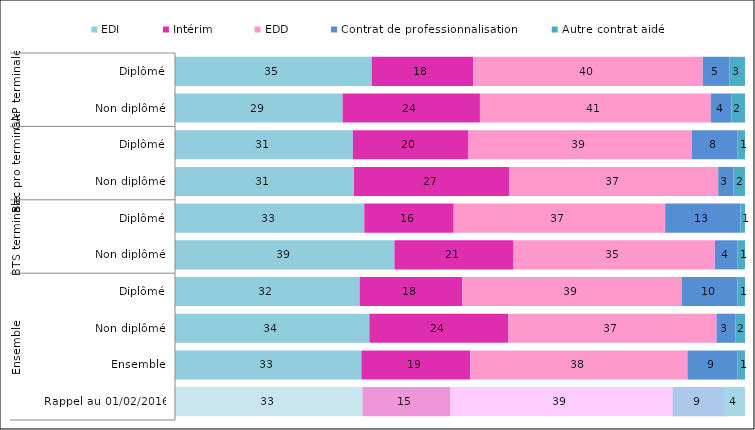
| Category | EDI | Intérim | EDD | Contrat de professionnalisation | Autre contrat aidé |
|---|---|---|---|---|---|
| 0 | 34.5 | 17.8 | 40.3 | 4.7 | 2.7 |
| 1 | 29.4 | 24.1 | 40.5 | 3.6 | 2.4 |
| 2 | 31.2 | 20.2 | 39.3 | 8 | 1.3 |
| 3 | 31.4 | 27.3 | 36.6 | 2.7 | 2 |
| 4 | 33.2 | 15.7 | 37.1 | 13.2 | 0.8 |
| 5 | 38.5 | 20.9 | 35.3 | 4 | 1.3 |
| 6 | 32.4 | 18 | 38.5 | 9.8 | 1.3 |
| 7 | 34.1 | 24.4 | 36.5 | 3.3 | 1.7 |
| 8 | 32.7 | 19.1 | 38.1 | 8.8 | 1.3 |
| 9 | 32.9 | 15.4 | 39 | 9 | 3.7 |